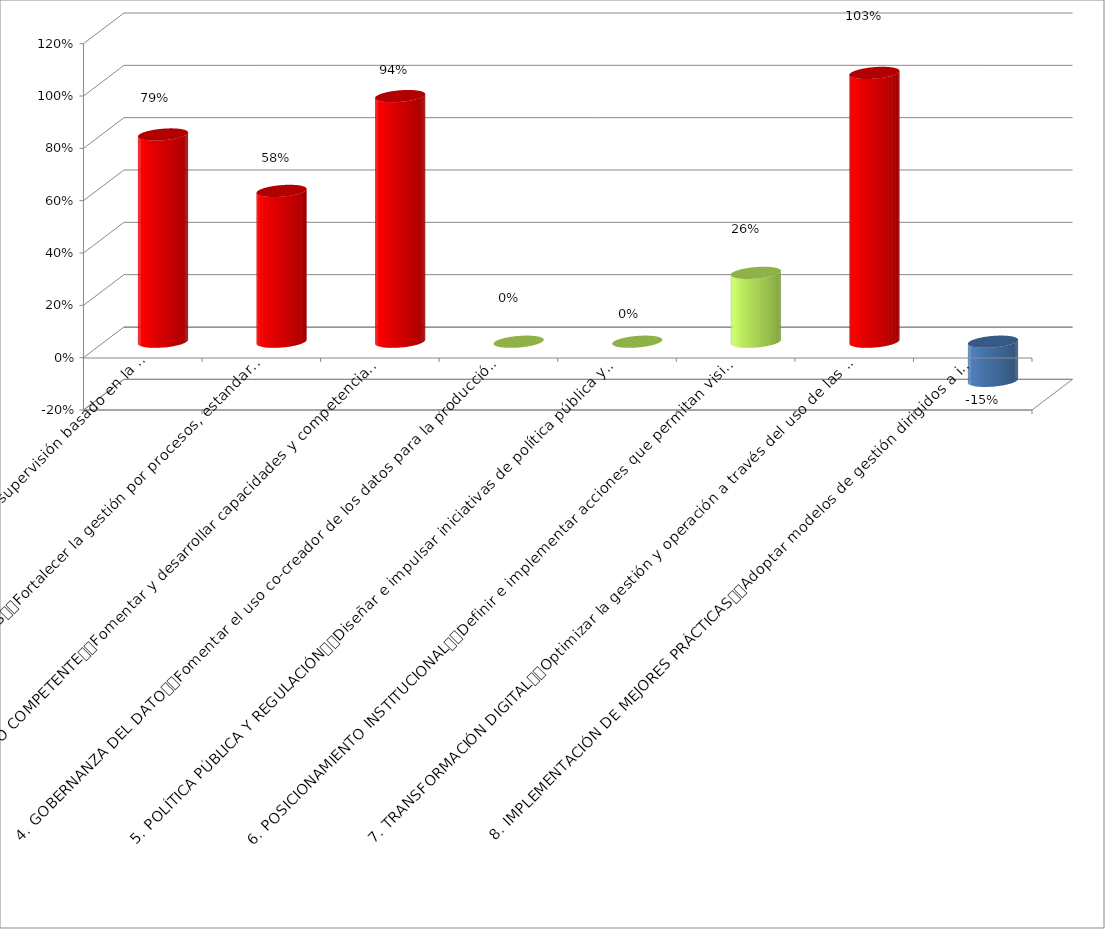
| Category | Series 0 |
|---|---|
| 1. MODELO DE GESTIÓN
Definir e implementar un modelo de supervisión basado en la gestión de riesgos, prospectivo, participativo y efectivo, que redunde en la sostenibilidad y avance de la economía solidaria. | 0.792 |
| 2. GESTIÓN POR PROCESOS Y PROYECTOS
Fortalecer la gestión por procesos, estandarizados e interdependientes, y por proyectos, para una prestación ágil, flexible y segura de servicios, mediante la mejora continua y la apropiación de las TIC. | 0.576 |
| 3. CAPITAL HUMANO COMPETENTE
Fomentar y desarrollar capacidades y competencias para contar con un capital humano, altamente calificado y motivado, que aporte a la transformación institucional y a la materialización de las líneas de acción que consoliden l | 0.939 |
| 4. GOBERNANZA DEL DATO
Fomentar el uso co-creador de los datos para la producción continua de información y conocimiento, que faciliten la toma de decisiones y el liderazgo sectorial. | 0 |
| 5. POLÍTICA PÚBLICA Y REGULACIÓN
Diseñar e impulsar iniciativas de política pública y generar regulación y doctrina unificadora para apoyar la gestión de la supervisión integral y el desarrollo del sector. | 0 |
| 6. POSICIONAMIENTO INSTITUCIONAL
Definir e implementar acciones que permitan visibilizar la gestión de la Supersolidaria, con el fin de incrementar sus recursos de autoridad y legitimidad en el sector, haciendo explícito su aporte al posicionamiento y ava | 0.263 |
| 7. TRANSFORMACIÓN DIGITAL
Optimizar la gestión y operación a través del uso de las TIC y su continua evolución, para satisfacer las necesidades y expectativas de las organizaciones, sus asociados, las demás entidades del sector y los ciudadanos en general | 1.027 |
| 8. IMPLEMENTACIÓN DE MEJORES PRÁCTICAS
Adoptar modelos de gestión dirigidos a implementar prácticas que impacten positivamente el ambiente, las personas, la información y el desarrollo administrativo, aportando al cumplimiento de los requisitos aplicables | -0.149 |